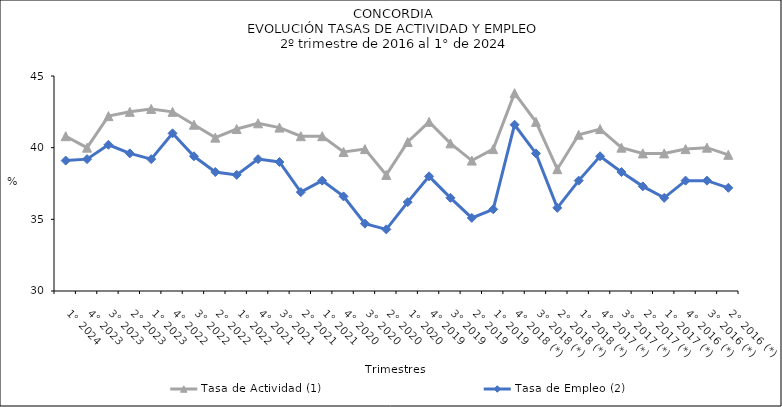
| Category | Tasa de Actividad (1) | Tasa de Empleo (2) |
|---|---|---|
| 1° 2024 | 40.8 | 39.1 |
| 4° 2023 | 40 | 39.2 |
| 3° 2023 | 42.2 | 40.2 |
| 2° 2023 | 42.5 | 39.6 |
| 1° 2023 | 42.7 | 39.2 |
| 4° 2022 | 42.5 | 41 |
| 3° 2022 | 41.6 | 39.4 |
| 2° 2022 | 40.7 | 38.3 |
| 1° 2022 | 41.3 | 38.1 |
| 4° 2021 | 41.7 | 39.2 |
| 3° 2021 | 41.4 | 39 |
| 2° 2021 | 40.8 | 36.9 |
| 1° 2021 | 40.8 | 37.7 |
| 4° 2020 | 39.7 | 36.6 |
| 3° 2020 | 39.9 | 34.7 |
| 2° 2020 | 38.1 | 34.3 |
| 1° 2020 | 40.4 | 36.2 |
| 4° 2019 | 41.8 | 38 |
| 3° 2019 | 40.3 | 36.5 |
| 2° 2019 | 39.1 | 35.1 |
| 1° 2019 | 39.9 | 35.7 |
| 4° 2018 (*) | 43.8 | 41.6 |
| 3° 2018 (*) | 41.8 | 39.6 |
| 2° 2018 (*) | 38.5 | 35.8 |
| 1° 2018 (*) | 40.9 | 37.7 |
| 4° 2017 (*) | 41.3 | 39.4 |
| 3° 2017 (*) | 40 | 38.3 |
| 2° 2017 (*) | 39.6 | 37.3 |
| 1° 2017 (*) | 39.6 | 36.5 |
| 4° 2016 (*) | 39.9 | 37.7 |
| 3° 2016 (*) | 40 | 37.7 |
| 2° 2016 (*) | 39.5 | 37.2 |